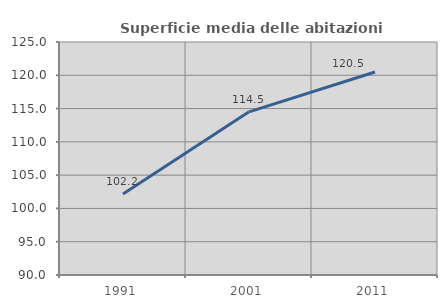
| Category | Superficie media delle abitazioni occupate |
|---|---|
| 1991.0 | 102.158 |
| 2001.0 | 114.512 |
| 2011.0 | 120.5 |